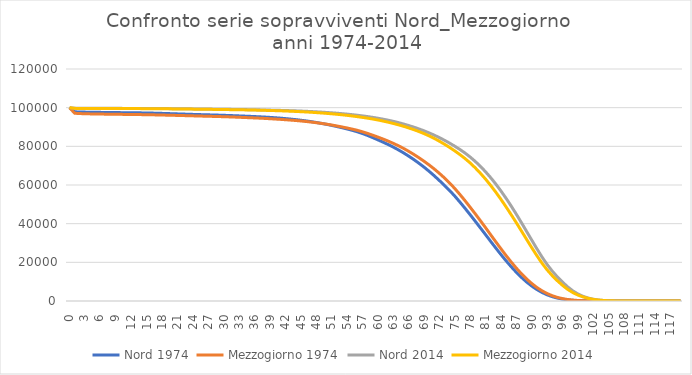
| Category | Nord 1974 | Mezzogiorno 1974 | Nord 2014 | Mezzogiorno 2014 |
|---|---|---|---|---|
| 0.0 | 100000 | 100000 | 100000 | 100000 |
| 1.0 | 97860 | 97097 | 99732 | 99636 |
| 2.0 | 97766 | 96951 | 99711 | 99613 |
| 3.0 | 97699 | 96852 | 99694 | 99596 |
| 4.0 | 97648 | 96785 | 99681 | 99584 |
| 5.0 | 97606 | 96734 | 99671 | 99575 |
| 6.0 | 97567 | 96689 | 99663 | 99567 |
| 7.0 | 97529 | 96647 | 99655 | 99559 |
| 8.0 | 97494 | 96609 | 99648 | 99551 |
| 9.0 | 97461 | 96573 | 99641 | 99543 |
| 10.0 | 97432 | 96539 | 99634 | 99535 |
| 11.0 | 97404 | 96505 | 99627 | 99527 |
| 12.0 | 97376 | 96472 | 99619 | 99520 |
| 13.0 | 97344 | 96437 | 99610 | 99511 |
| 14.0 | 97305 | 96399 | 99600 | 99501 |
| 15.0 | 97258 | 96355 | 99589 | 99488 |
| 16.0 | 97200 | 96304 | 99575 | 99472 |
| 17.0 | 97129 | 96246 | 99557 | 99452 |
| 18.0 | 97048 | 96182 | 99536 | 99429 |
| 19.0 | 96964 | 96117 | 99512 | 99401 |
| 20.0 | 96878 | 96051 | 99486 | 99371 |
| 21.0 | 96791 | 95984 | 99459 | 99340 |
| 22.0 | 96704 | 95915 | 99430 | 99310 |
| 23.0 | 96616 | 95843 | 99400 | 99280 |
| 24.0 | 96527 | 95767 | 99368 | 99249 |
| 25.0 | 96445 | 95692 | 99334 | 99217 |
| 26.0 | 96369 | 95618 | 99300 | 99184 |
| 27.0 | 96297 | 95548 | 99267 | 99149 |
| 28.0 | 96221 | 95479 | 99234 | 99112 |
| 29.0 | 96141 | 95406 | 99201 | 99073 |
| 30.0 | 96053 | 95326 | 99168 | 99032 |
| 31.0 | 95959 | 95237 | 99134 | 98991 |
| 32.0 | 95859 | 95136 | 99097 | 98949 |
| 33.0 | 95754 | 95028 | 99057 | 98906 |
| 34.0 | 95644 | 94918 | 99014 | 98860 |
| 35.0 | 95529 | 94806 | 98967 | 98810 |
| 36.0 | 95410 | 94692 | 98918 | 98752 |
| 37.0 | 95282 | 94572 | 98864 | 98688 |
| 38.0 | 95139 | 94438 | 98806 | 98618 |
| 39.0 | 94979 | 94290 | 98743 | 98545 |
| 40.0 | 94797 | 94129 | 98678 | 98467 |
| 41.0 | 94591 | 93958 | 98609 | 98382 |
| 42.0 | 94359 | 93771 | 98535 | 98284 |
| 43.0 | 94104 | 93576 | 98452 | 98176 |
| 44.0 | 93827 | 93366 | 98360 | 98056 |
| 45.0 | 93521 | 93131 | 98256 | 97925 |
| 46.0 | 93180 | 92867 | 98141 | 97783 |
| 47.0 | 92798 | 92571 | 98012 | 97628 |
| 48.0 | 92369 | 92242 | 97870 | 97456 |
| 49.0 | 91900 | 91887 | 97711 | 97269 |
| 50.0 | 91406 | 91495 | 97539 | 97064 |
| 51.0 | 90868 | 91060 | 97353 | 96841 |
| 52.0 | 90284 | 90574 | 97149 | 96600 |
| 53.0 | 89667 | 90057 | 96923 | 96335 |
| 54.0 | 89018 | 89523 | 96676 | 96041 |
| 55.0 | 88331 | 88952 | 96402 | 95722 |
| 56.0 | 87578 | 88317 | 96102 | 95377 |
| 57.0 | 86690 | 87563 | 95775 | 95002 |
| 58.0 | 85676 | 86725 | 95411 | 94595 |
| 59.0 | 84575 | 85811 | 95010 | 94152 |
| 60.0 | 83422 | 84843 | 94569 | 93661 |
| 61.0 | 82242 | 83841 | 94087 | 93120 |
| 62.0 | 81003 | 82773 | 93555 | 92523 |
| 63.0 | 79684 | 81615 | 92969 | 91872 |
| 64.0 | 78254 | 80367 | 92315 | 91172 |
| 65.0 | 76720 | 79012 | 91597 | 90419 |
| 66.0 | 75050 | 77525 | 90812 | 89582 |
| 67.0 | 73278 | 75926 | 89979 | 88685 |
| 68.0 | 71362 | 74201 | 89066 | 87714 |
| 69.0 | 69353 | 72386 | 88081 | 86641 |
| 70.0 | 67178 | 70444 | 87000 | 85450 |
| 71.0 | 64870 | 68377 | 85836 | 84157 |
| 72.0 | 62417 | 66123 | 84558 | 82708 |
| 73.0 | 59892 | 63726 | 83191 | 81146 |
| 74.0 | 57238 | 61132 | 81718 | 79492 |
| 75.0 | 54389 | 58305 | 80127 | 77719 |
| 76.0 | 51298 | 55242 | 78443 | 75817 |
| 77.0 | 48082 | 52003 | 76607 | 73764 |
| 78.0 | 44755 | 48636 | 74553 | 71497 |
| 79.0 | 41358 | 45179 | 72266 | 68956 |
| 80.0 | 37916 | 41653 | 69736 | 66171 |
| 81.0 | 34445 | 38058 | 66958 | 63163 |
| 82.0 | 30955 | 34390 | 63915 | 59893 |
| 83.0 | 27507 | 30734 | 60602 | 56409 |
| 84.0 | 24142 | 27131 | 57054 | 52717 |
| 85.0 | 20898 | 23628 | 53249 | 48819 |
| 86.0 | 17815 | 20269 | 49247 | 44772 |
| 87.0 | 14933 | 17102 | 45029 | 40618 |
| 88.0 | 12284 | 14166 | 40650 | 36336 |
| 89.0 | 9897 | 11498 | 36132 | 32022 |
| 90.0 | 7793 | 9126 | 31639 | 27726 |
| 91.0 | 5982 | 7067 | 27183 | 23578 |
| 92.0 | 4465 | 5327 | 22903 | 19681 |
| 93.0 | 3231 | 3898 | 18986 | 16197 |
| 94.0 | 2259 | 2761 | 15558 | 13188 |
| 95.0 | 1522 | 1888 | 12544 | 10531 |
| 96.0 | 985 | 1244 | 9870 | 8163 |
| 97.0 | 611 | 787 | 7387 | 6066 |
| 98.0 | 362 | 476 | 5316 | 4406 |
| 99.0 | 204 | 275 | 3677 | 3102 |
| 100.0 | 109 | 151 | 2441 | 2117 |
| 101.0 | 55 | 79 | 1552 | 1381 |
| 102.0 | 26 | 39 | 944 | 850 |
| 103.0 | 12 | 18 | 545 | 496 |
| 104.0 | 5 | 8 | 297 | 273 |
| 105.0 | 2 | 3 | 152 | 142 |
| 106.0 | 1 | 1 | 73 | 69 |
| 107.0 | 0 | 0 | 33 | 31 |
| 108.0 | 0 | 0 | 14 | 13 |
| 109.0 | 0 | 0 | 5 | 5 |
| 110.0 | 0 | 0 | 2 | 2 |
| 111.0 | 0 | 0 | 1 | 1 |
| 112.0 | 0 | 0 | 0 | 0 |
| 113.0 | 0 | 0 | 0 | 0 |
| 114.0 | 0 | 0 | 0 | 0 |
| 115.0 | 0 | 0 | 0 | 0 |
| 116.0 | 0 | 0 | 0 | 0 |
| 117.0 | 0 | 0 | 0 | 0 |
| 118.0 | 0 | 0 | 0 | 0 |
| 119.0 | 0 | 0 | 0 | 0 |